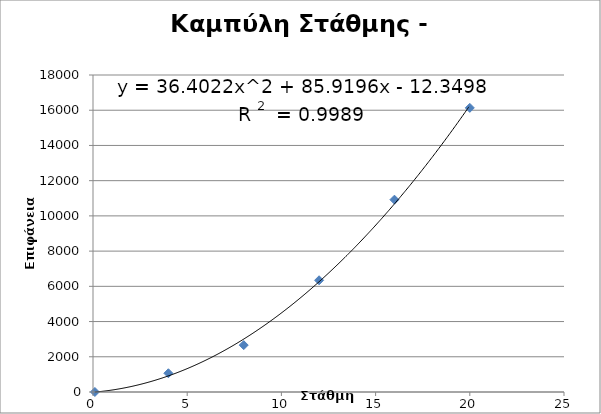
| Category | Series 0 |
|---|---|
| 0.1 | 1 |
| 4.0 | 1064 |
| 8.0 | 2662 |
| 12.0 | 6344 |
| 16.0 | 10920 |
| 20.0 | 16133 |